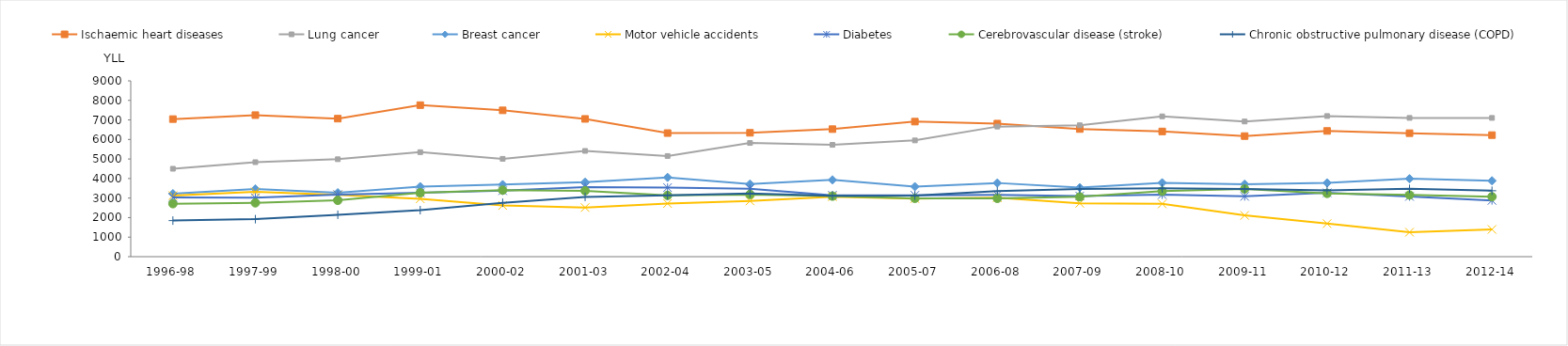
| Category | Ischaemic heart diseases | Lung cancer | Breast cancer | Motor vehicle accidents | Diabetes | Cerebrovascular disease (stroke) | Chronic obstructive pulmonary disease (COPD) |
|---|---|---|---|---|---|---|---|
| 1996-98 | 7042.826 | 4501.251 | 3224.945 | 3125.465 | 3035.564 | 2712.564 | 1847.529 |
| 1997-99 | 7245.692 | 4837.726 | 3468.569 | 3316.879 | 3018.507 | 2755.604 | 1919.986 |
| 1998-00 | 7066.268 | 4988.367 | 3273.263 | 3160.931 | 3178.418 | 2882.654 | 2144.881 |
| 1999-01 | 7757.009 | 5349.878 | 3586.909 | 2962.6 | 3274.69 | 3270.832 | 2380.379 |
| 2000-02 | 7491.021 | 5009.237 | 3688.255 | 2619.415 | 3377.011 | 3406.664 | 2760.211 |
| 2001-03 | 7052.648 | 5414.806 | 3812.198 | 2515.203 | 3567.07 | 3373.076 | 3060.748 |
| 2002-04 | 6327.139 | 5152.505 | 4057.279 | 2722.082 | 3535.16 | 3135.834 | 3134.847 |
| 2003-05 | 6341.35 | 5820.117 | 3717.272 | 2852.607 | 3480.704 | 3180.18 | 3234.435 |
| 2004-06 | 6529.592 | 5724.977 | 3931.706 | 3073.571 | 3145.274 | 3098.283 | 3122.255 |
| 2005-07 | 6914.194 | 5951.394 | 3585.829 | 2972.875 | 3144.543 | 2985.508 | 3124.631 |
| 2006-08 | 6811.8 | 6659.674 | 3771.985 | 3019.622 | 3160.863 | 2983.976 | 3353.091 |
| 2007-09 | 6534.837 | 6727.822 | 3534.647 | 2732.259 | 3105.117 | 3062.646 | 3461.683 |
| 2008-10 | 6410.038 | 7183.689 | 3783.123 | 2701.797 | 3175.24 | 3351.037 | 3496.004 |
| 2009-11 | 6172.625 | 6920.008 | 3709.786 | 2113.69 | 3087.405 | 3467.909 | 3467.186 |
| 2010-12 | 6436.423 | 7199.443 | 3778.249 | 1691.901 | 3267.858 | 3239.003 | 3398.521 |
| 2011-13 | 6321.948 | 7103.934 | 3989.586 | 1253.204 | 3081.841 | 3159.034 | 3472.958 |
| 2012-14 | 6222.68 | 7103.231 | 3884.129 | 1395.631 | 2880.207 | 3070.716 | 3375.651 |